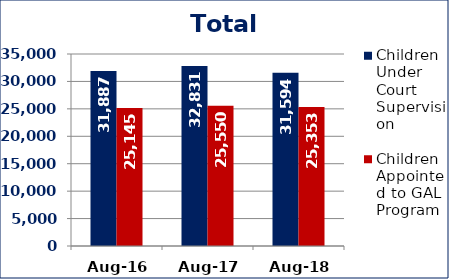
| Category | Children Under Court Supervision  | Children Appointed to GAL Program  |
|---|---|---|
| Aug-16 | 31887 | 25145 |
| Aug-17 | 32831 | 25550 |
| Aug-18 | 31594 | 25353 |